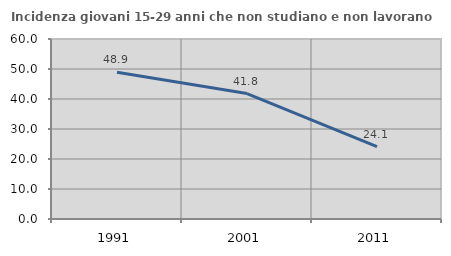
| Category | Incidenza giovani 15-29 anni che non studiano e non lavorano  |
|---|---|
| 1991.0 | 48.89 |
| 2001.0 | 41.822 |
| 2011.0 | 24.116 |